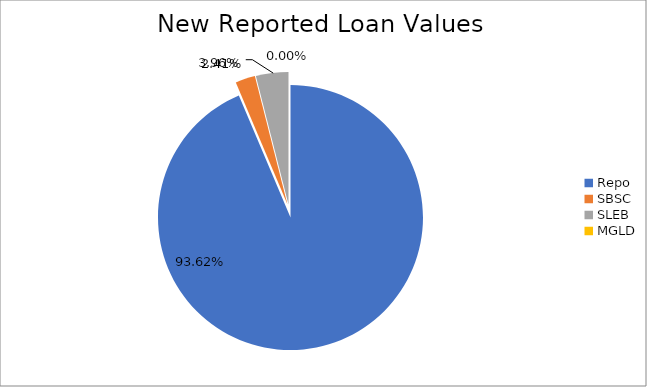
| Category | Series 0 |
|---|---|
| Repo | 9828852 |
| SBSC | 253517.089 |
| SLEB | 415760.454 |
| MGLD | 23.868 |